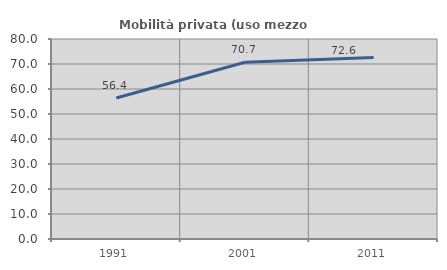
| Category | Mobilità privata (uso mezzo privato) |
|---|---|
| 1991.0 | 56.414 |
| 2001.0 | 70.69 |
| 2011.0 | 72.587 |